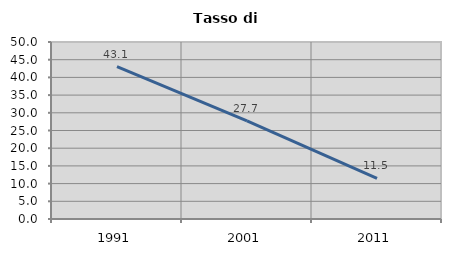
| Category | Tasso di disoccupazione   |
|---|---|
| 1991.0 | 43.065 |
| 2001.0 | 27.735 |
| 2011.0 | 11.477 |